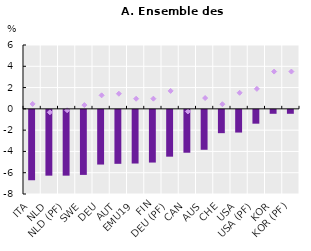
| Category | 2022 (↗) |
|---|---|
| ITA | -6.614 |
| NLD | -6.183 |
| NLD (PF) | -6.183 |
| SWE | -6.112 |
| DEU | -5.139 |
| AUT | -5.07 |
| EMU19 | -5.043 |
| FIN | -4.951 |
| DEU (PF) | -4.398 |
| CAN | -4.029 |
| AUS | -3.751 |
| CHE | -2.191 |
| USA | -2.132 |
| USA (PF) | -1.299 |
| KOR | -0.369 |
| KOR (PF) | -0.369 |